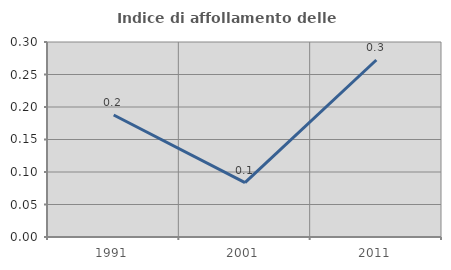
| Category | Indice di affollamento delle abitazioni  |
|---|---|
| 1991.0 | 0.188 |
| 2001.0 | 0.084 |
| 2011.0 | 0.272 |